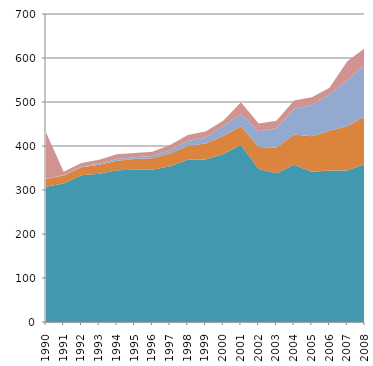
| Category | Hydro | Biomass | Wind | Other |
|---|---|---|---|---|
| 1990.0 | 307.622 | 17.301 | 0.778 | 104.778 |
| 1991.0 | 314.846 | 18.259 | 1.096 | 7.474 |
| 1992.0 | 333.516 | 18.383 | 1.55 | 7.952 |
| 1993.0 | 337.061 | 20.044 | 2.356 | 9.356 |
| 1994.0 | 344.629 | 22.065 | 3.494 | 10.835 |
| 1995.0 | 345.97 | 24.349 | 4.069 | 9.932 |
| 1996.0 | 346.22 | 26.055 | 4.848 | 9.56 |
| 1997.0 | 354.074 | 28.746 | 7.332 | 12.2 |
| 1998.0 | 368.865 | 31.373 | 11.278 | 13.512 |
| 1999.0 | 369.099 | 36.614 | 14.204 | 12.962 |
| 2000.0 | 381.937 | 40.549 | 22.25 | 12.624 |
| 2001.0 | 402.051 | 42.787 | 26.977 | 27.574 |
| 2002.0 | 347.931 | 49.715 | 35.746 | 17.962 |
| 2003.0 | 338.307 | 57.915 | 44.358 | 16.531 |
| 2004.0 | 357.147 | 68.851 | 58.815 | 18.66 |
| 2005.0 | 341.744 | 80.685 | 70.485 | 18.088 |
| 2006.0 | 344.348 | 90.128 | 82.306 | 15.87 |
| 2007.0 | 344.236 | 100.76 | 104.337 | 43.072 |
| 2008.0 | 359.185 | 107.855 | 118.733 | 37.126 |